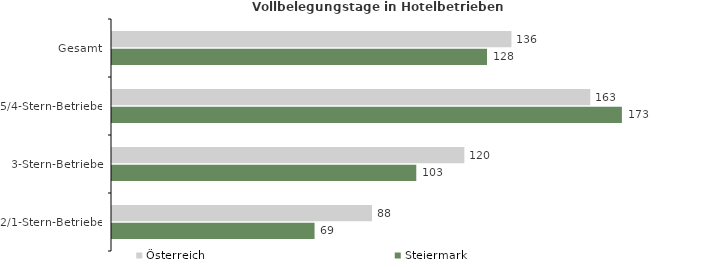
| Category | Österreich | Steiermark |
|---|---|---|
| Gesamt | 135.866 | 127.561 |
| 5/4-Stern-Betriebe | 162.683 | 173.435 |
| 3-Stern-Betriebe | 119.851 | 103.499 |
| 2/1-Stern-Betriebe | 88.435 | 68.894 |